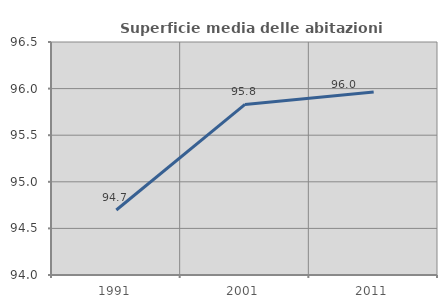
| Category | Superficie media delle abitazioni occupate |
|---|---|
| 1991.0 | 94.697 |
| 2001.0 | 95.83 |
| 2011.0 | 95.963 |